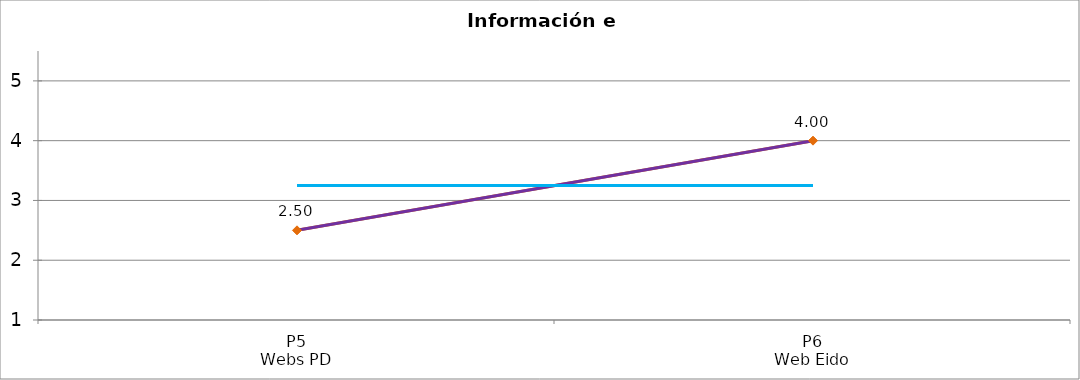
| Category | Valoración (1-5) | MEDIA |
|---|---|---|
| P5
Webs PD | 2.5 | 3.25 |
| P6
Web Eido | 4 | 3.25 |